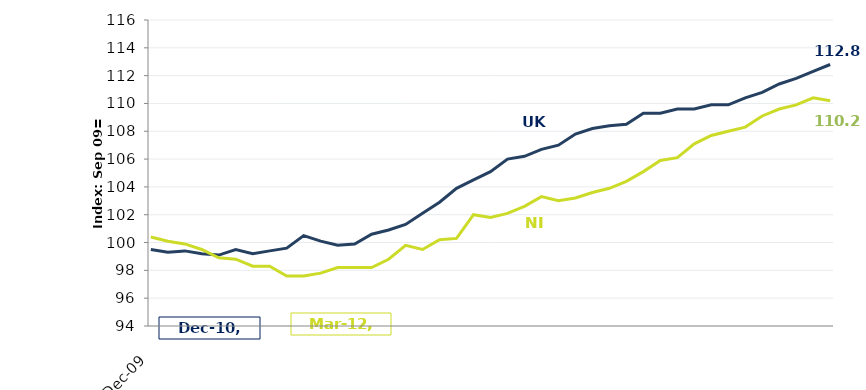
| Category | UK |
|---|---|
| 2009-12-01 | 99.5 |
| 2010-03-01 | 99.3 |
| 2010-06-01 | 99.4 |
| 2010-09-01 | 99.2 |
| 2010-12-01 | 99.1 |
| 2011-03-01 | 99.5 |
| 2011-06-01 | 99.2 |
| 2011-09-01 | 99.4 |
| 2011-12-01 | 99.6 |
| 2012-03-01 | 100.5 |
| 2012-06-01 | 100.1 |
| 2012-09-01 | 99.8 |
| 2012-12-01 | 99.9 |
| 2013-03-01 | 100.6 |
| 2013-06-01 | 100.9 |
| 2013-09-01 | 101.3 |
| 2013-12-01 | 102.1 |
| 2014-03-01 | 102.9 |
| 2014-06-01 | 103.9 |
| 2014-09-01 | 104.5 |
| 2014-12-01 | 105.1 |
| 2015-03-01 | 106 |
| 2015-06-01 | 106.2 |
| 2015-09-01 | 106.7 |
| 2015-12-01 | 107 |
| 2016-03-01 | 107.8 |
| 2016-06-01 | 108.2 |
| 2016-09-01 | 108.4 |
| 2016-12-01 | 108.5 |
| 2017-03-01 | 109.3 |
| 2017-06-01 | 109.3 |
| 2017-09-01 | 109.6 |
| 2017-12-01 | 109.6 |
| 2018-03-01 | 109.9 |
| 2018-06-01 | 109.9 |
| 2018-09-01 | 110.4 |
| 2018-12-01 | 110.8 |
| 2019-03-01 | 111.4 |
| 2019-06-01 | 111.8 |
| 2019-09-01 | 112.3 |
| 2019-12-01 | 112.8 |